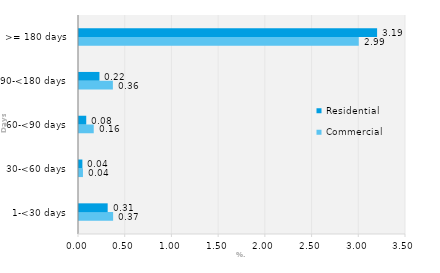
| Category | Commercial | Residential |
|---|---|---|
| 1-<30 days | 0.365 | 0.307 |
| 30-<60 days | 0.042 | 0.036 |
| 60-<90 days | 0.158 | 0.077 |
| 90-<180 days | 0.363 | 0.219 |
| >= 180 days | 2.994 | 3.191 |